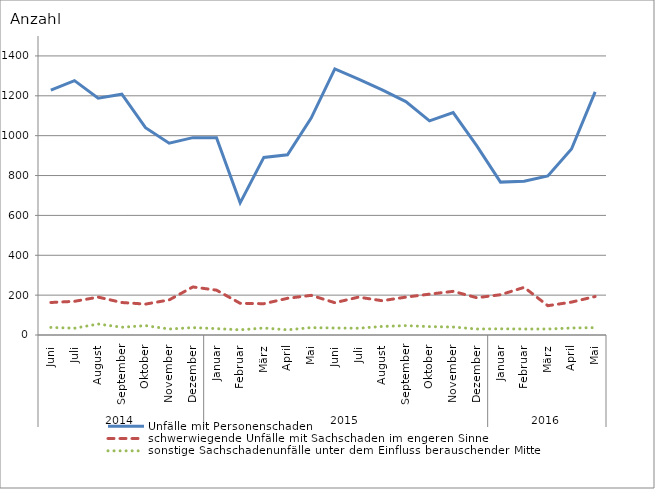
| Category | Unfälle mit Personenschaden | schwerwiegende Unfälle mit Sachschaden im engeren Sinne | sonstige Sachschadenunfälle unter dem Einfluss berauschender Mittel |
|---|---|---|---|
| 0 | 1228 | 163 | 38 |
| 1 | 1276 | 169 | 34 |
| 2 | 1188 | 190 | 55 |
| 3 | 1208 | 163 | 39 |
| 4 | 1040 | 155 | 47 |
| 5 | 962 | 176 | 30 |
| 6 | 990 | 241 | 37 |
| 7 | 990 | 225 | 32 |
| 8 | 663 | 159 | 26 |
| 9 | 891 | 157 | 35 |
| 10 | 904 | 184 | 26 |
| 11 | 1088 | 199 | 37 |
| 12 | 1335 | 162 | 35 |
| 13 | 1284 | 190 | 34 |
| 14 | 1230 | 172 | 43 |
| 15 | 1171 | 190 | 47 |
| 16 | 1074 | 205 | 42 |
| 17 | 1116 | 219 | 40 |
| 18 | 949 | 187 | 30 |
| 19 | 767 | 202 | 31 |
| 20 | 771 | 239 | 30 |
| 21 | 798 | 147 | 30 |
| 22 | 933 | 165 | 35 |
| 23 | 1220 | 193 | 37 |